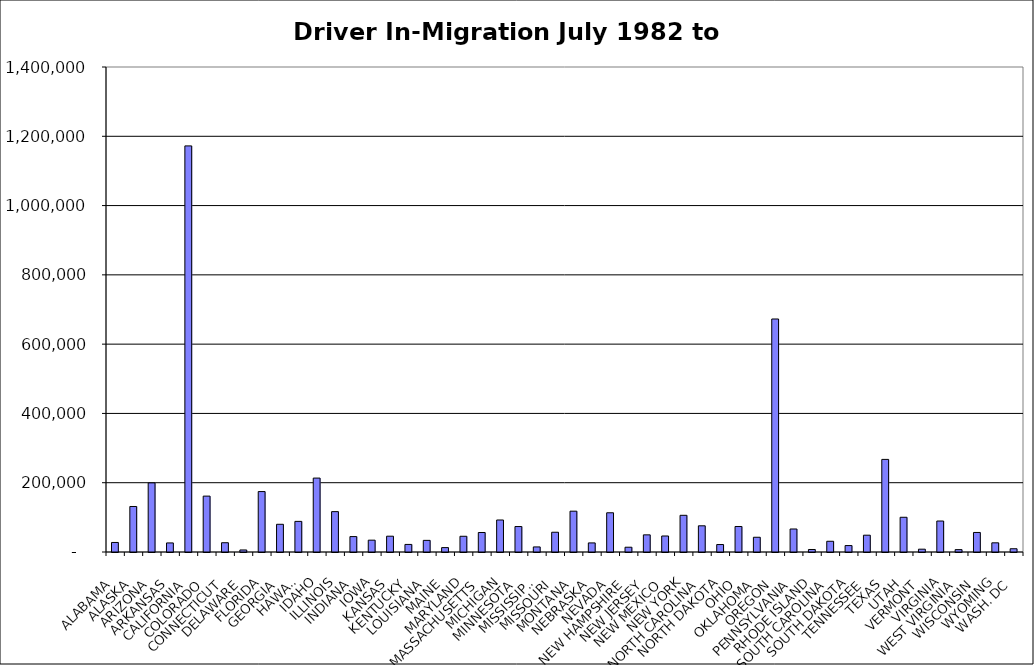
| Category | Series 0 |
|---|---|
| ALABAMA | 27553.5 |
| ALASKA | 131381.5 |
| ARIZONA | 199505 |
| ARKANSAS | 26173.5 |
| CALIFORNIA | 1172241.5 |
| COLORADO | 161298 |
| CONNECTICUT | 26766 |
| DELAWARE | 5893.5 |
| FLORIDA | 174447 |
| GEORGIA | 79991 |
| HAWAII | 88379.5 |
| IDAHO | 213365.5 |
| ILLINOIS | 116544.5 |
| INDIANA | 44488 |
| IOWA | 34153.5 |
| KANSAS | 45640.5 |
| KENTUCKY | 21837 |
| LOUISIANA | 33578.5 |
| MAINE | 12708.5 |
| MARYLAND | 45380 |
| MASSACHUSETTS | 56258 |
| MICHIGAN | 92395 |
| MINNESOTA | 73508.5 |
| MISSISSIPPI | 14643 |
| MISSOURI | 57034 |
| MONTANA | 117814 |
| NEBRASKA | 26230.5 |
| NEVADA | 113228 |
| NEW HAMPSHIRE | 13796.5 |
| NEW JERSEY | 49479 |
| NEW MEXICO | 46212 |
| NEW YORK | 105938 |
| NORTH CAROLINA | 75616.5 |
| NORTH DAKOTA | 21541.5 |
| OHIO | 73647.5 |
| OKLAHOMA | 42576 |
| OREGON | 672589 |
| PENNSYLVANIA | 66395.5 |
| RHODE ISLAND | 7258 |
| SOUTH CAROLINA | 30967.5 |
| SOUTH DAKOTA | 18579.5 |
| TENNESSEE | 48491.5 |
| TEXAS | 267309 |
| UTAH | 100255.5 |
| VERMONT | 8130 |
| VIRGINIA | 89418 |
| WEST VIRGINIA | 6855.5 |
| WISCONSIN | 56396.5 |
| WYOMING | 26492 |
| WASH. DC | 9398 |